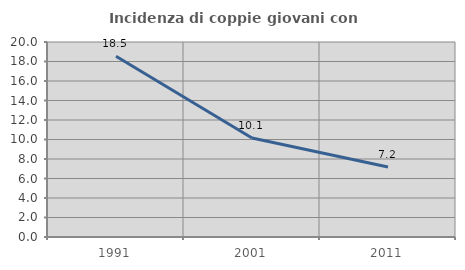
| Category | Incidenza di coppie giovani con figli |
|---|---|
| 1991.0 | 18.546 |
| 2001.0 | 10.147 |
| 2011.0 | 7.184 |